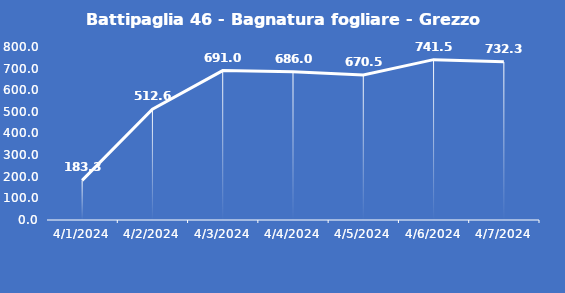
| Category | Battipaglia 46 - Bagnatura fogliare - Grezzo (min) |
|---|---|
| 4/1/24 | 183.3 |
| 4/2/24 | 512.6 |
| 4/3/24 | 691 |
| 4/4/24 | 686 |
| 4/5/24 | 670.5 |
| 4/6/24 | 741.5 |
| 4/7/24 | 732.3 |